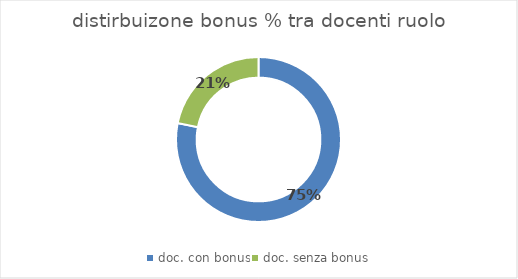
| Category | Series 0 |
|---|---|
| doc. con bonus | 0.753 |
| doc. senza bonus | 0.21 |